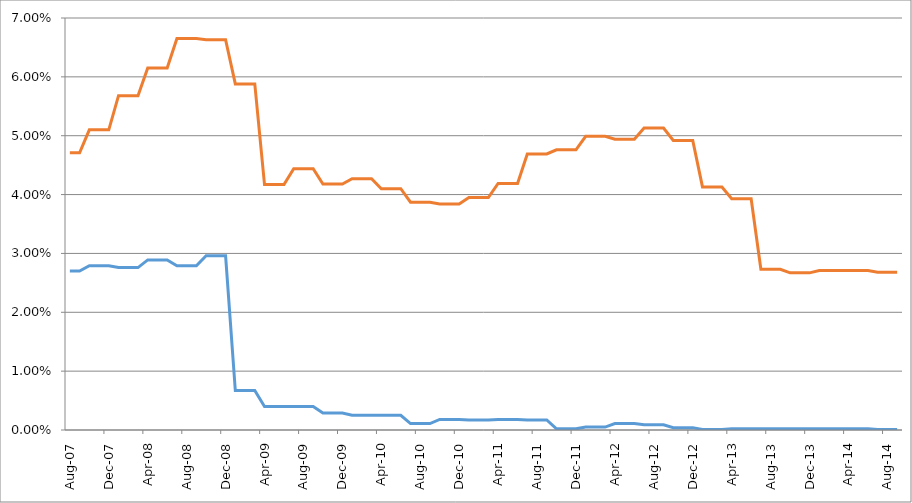
| Category | Series 0 | Series 1 |
|---|---|---|
| 2007-08-01 | 0.027 | 0.047 |
| 2007-09-01 | 0.027 | 0.047 |
| 2007-10-01 | 0.028 | 0.051 |
| 2007-11-01 | 0.028 | 0.051 |
| 2007-12-01 | 0.028 | 0.051 |
| 2008-01-01 | 0.028 | 0.057 |
| 2008-02-01 | 0.028 | 0.057 |
| 2008-03-01 | 0.028 | 0.057 |
| 2008-04-01 | 0.029 | 0.062 |
| 2008-05-01 | 0.029 | 0.062 |
| 2008-06-01 | 0.029 | 0.062 |
| 2008-07-01 | 0.028 | 0.066 |
| 2008-08-01 | 0.028 | 0.066 |
| 2008-09-01 | 0.028 | 0.066 |
| 2008-10-01 | 0.03 | 0.066 |
| 2008-11-01 | 0.03 | 0.066 |
| 2008-12-01 | 0.03 | 0.066 |
| 2009-01-01 | 0.007 | 0.059 |
| 2009-02-01 | 0.007 | 0.059 |
| 2009-03-01 | 0.007 | 0.059 |
| 2009-04-01 | 0.004 | 0.042 |
| 2009-05-01 | 0.004 | 0.042 |
| 2009-06-01 | 0.004 | 0.042 |
| 2009-07-01 | 0.004 | 0.044 |
| 2009-08-01 | 0.004 | 0.044 |
| 2009-09-01 | 0.004 | 0.044 |
| 2009-10-01 | 0.003 | 0.042 |
| 2009-11-01 | 0.003 | 0.042 |
| 2009-12-01 | 0.003 | 0.042 |
| 2010-01-01 | 0.002 | 0.043 |
| 2010-02-01 | 0.002 | 0.043 |
| 2010-03-01 | 0.002 | 0.043 |
| 2010-04-01 | 0.002 | 0.041 |
| 2010-05-01 | 0.002 | 0.041 |
| 2010-06-01 | 0.002 | 0.041 |
| 2010-07-01 | 0.001 | 0.039 |
| 2010-08-01 | 0.001 | 0.039 |
| 2010-09-01 | 0.001 | 0.039 |
| 2010-10-01 | 0.002 | 0.038 |
| 2010-11-01 | 0.002 | 0.038 |
| 2010-12-01 | 0.002 | 0.038 |
| 2011-01-01 | 0.002 | 0.04 |
| 2011-02-01 | 0.002 | 0.04 |
| 2011-03-01 | 0.002 | 0.04 |
| 2011-04-01 | 0.002 | 0.042 |
| 2011-05-01 | 0.002 | 0.042 |
| 2011-06-01 | 0.002 | 0.042 |
| 2011-07-01 | 0.002 | 0.047 |
| 2011-08-01 | 0.002 | 0.047 |
| 2011-09-01 | 0.002 | 0.047 |
| 2011-10-01 | 0 | 0.048 |
| 2011-11-01 | 0 | 0.048 |
| 2011-12-01 | 0 | 0.048 |
| 2012-01-01 | 0 | 0.05 |
| 2012-02-01 | 0 | 0.05 |
| 2012-03-01 | 0 | 0.05 |
| 2012-04-01 | 0.001 | 0.049 |
| 2012-05-01 | 0.001 | 0.049 |
| 2012-06-01 | 0.001 | 0.049 |
| 2012-07-01 | 0.001 | 0.051 |
| 2012-08-01 | 0.001 | 0.051 |
| 2012-09-01 | 0.001 | 0.051 |
| 2012-10-01 | 0 | 0.049 |
| 2012-11-01 | 0 | 0.049 |
| 2012-12-01 | 0 | 0.049 |
| 2013-01-01 | 0 | 0.041 |
| 2013-02-01 | 0 | 0.041 |
| 2013-03-01 | 0 | 0.041 |
| 2013-04-01 | 0 | 0.039 |
| 2013-05-01 | 0 | 0.039 |
| 2013-06-01 | 0 | 0.039 |
| 2013-07-01 | 0 | 0.027 |
| 2013-08-01 | 0 | 0.027 |
| 2013-09-01 | 0 | 0.027 |
| 2013-10-01 | 0 | 0.027 |
| 2013-11-01 | 0 | 0.027 |
| 2013-12-01 | 0 | 0.027 |
| 2014-01-01 | 0 | 0.027 |
| 2014-02-01 | 0 | 0.027 |
| 2014-03-01 | 0 | 0.027 |
| 2014-04-01 | 0 | 0.027 |
| 2014-05-01 | 0 | 0.027 |
| 2014-06-01 | 0 | 0.027 |
| 2014-07-01 | 0 | 0.027 |
| 2014-08-01 | 0 | 0.027 |
| 2014-09-01 | 0 | 0.027 |